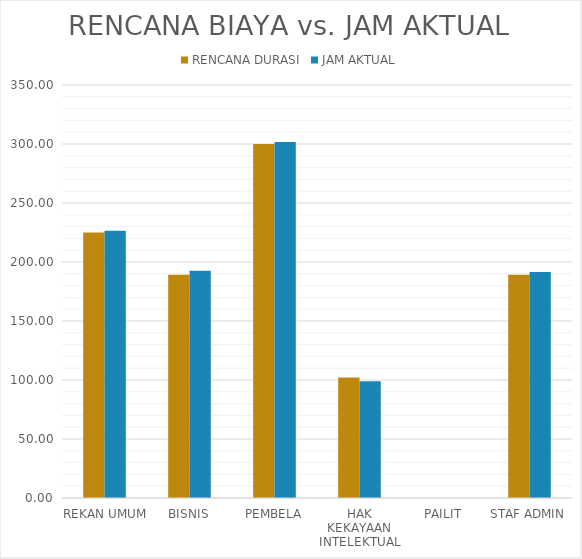
| Category | RENCANA DURASI | JAM AKTUAL |
|---|---|---|
| REKAN UMUM | 225 | 226.5 |
| BISNIS | 189.286 | 192.5 |
| PEMBELA | 300 | 301.714 |
| HAK KEKAYAAN INTELEKTUAL | 102.143 | 99 |
| PAILIT | 0 | 0 |
| STAF ADMIN | 189.286 | 191.429 |